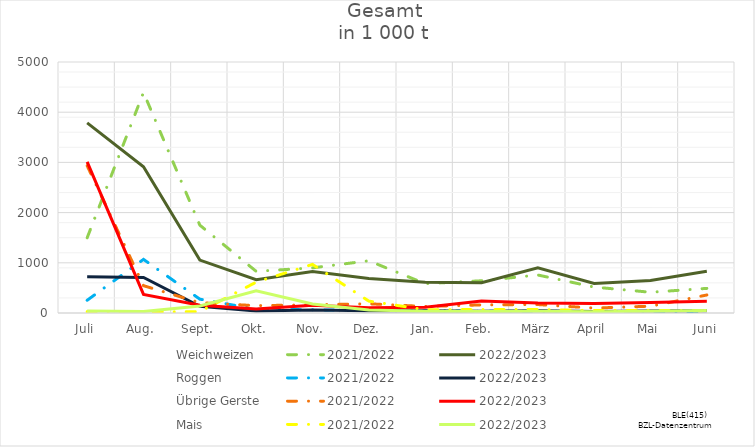
| Category | Weichweizen | 2021/2022 | 2022/2023 | Roggen | Übrige Gerste | Mais |
|---|---|---|---|---|---|---|
| Juli |  | 27.984 | 37.687 |  |  |  |
| Aug. |  | 18.932 | 27.917 |  |  |  |
| Sept. |  | 27.879 | 139.634 |  |  |  |
| Okt. |  | 614.613 | 442.342 |  |  |  |
| Nov. |  | 968.323 | 179.542 |  |  |  |
| Dez. |  | 236.85 | 59.626 |  |  |  |
| Jan. |  | 65.407 | 33.147 |  |  |  |
| Feb. |  | 68.286 | 31.265 |  |  |  |
| März |  | 70.963 | 35.799 |  |  |  |
| April |  | 48.484 | 24.384 |  |  |  |
| Mai |  | 50.516 | 36.805 |  |  |  |
| Juni |  | 46.032 | 48.765 |  |  |  |